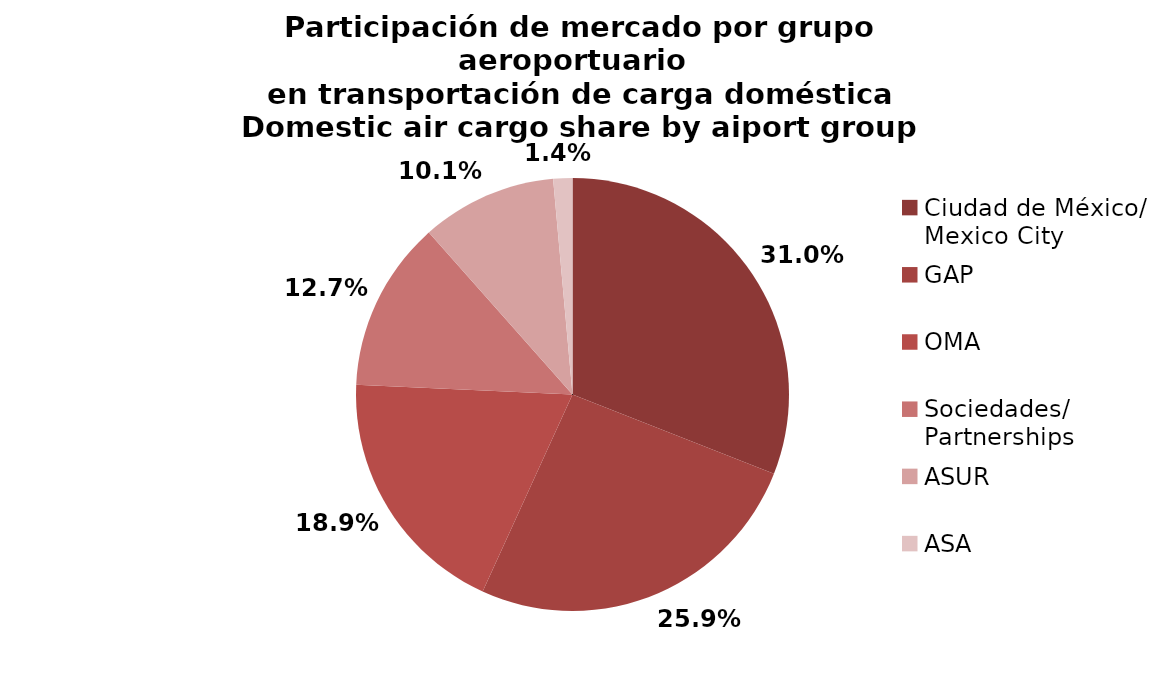
| Category | Series 0 |
|---|---|
| Ciudad de México/
Mexico City | 8673.96 |
| GAP | 7237.412 |
| OMA | 5296.067 |
| Sociedades/
Partnerships | 3566.24 |
| ASUR | 2833.171 |
| ASA | 400.315 |